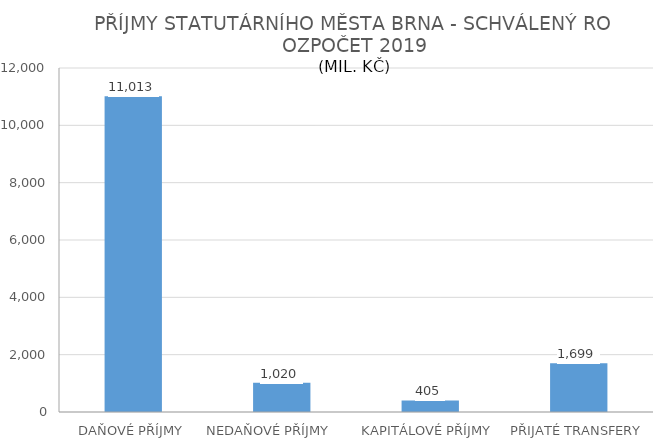
| Category | Series 0 |
|---|---|
| DAŇOVÉ PŘÍJMY | 11013.297 |
| NEDAŇOVÉ PŘÍJMY              | 1020.036 |
| KAPITÁLOVÉ PŘÍJMY  | 405.105 |
| PŘIJATÉ TRANSFERY | 1699.161 |